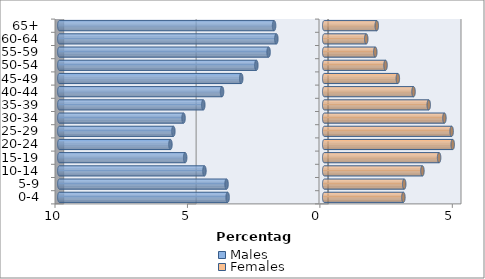
| Category | Males | Females |
|---|---|---|
| 0-4 | -3.646 | 2.989 |
| 5-9 | -3.687 | 3.02 |
| 10-14 | -4.522 | 3.707 |
| 15-19 | -5.25 | 4.337 |
| 20-24 | -5.806 | 4.851 |
| 25-29 | -5.695 | 4.811 |
| 30-34 | -5.311 | 4.538 |
| 35-39 | -4.565 | 3.946 |
| 40-44 | -3.858 | 3.372 |
| 45-49 | -3.134 | 2.779 |
| 50-54 | -2.562 | 2.315 |
| 55-59 | -2.1 | 1.928 |
| 60-64 | -1.808 | 1.586 |
| 65+ | -1.893 | 1.984 |